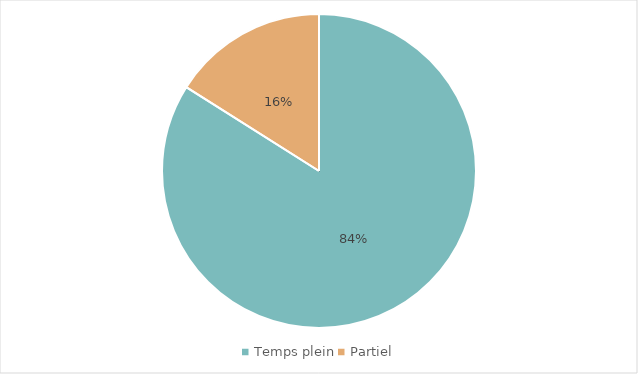
| Category | Total |
|---|---|
| Temps plein | 94246 |
| Partiel | 17997 |